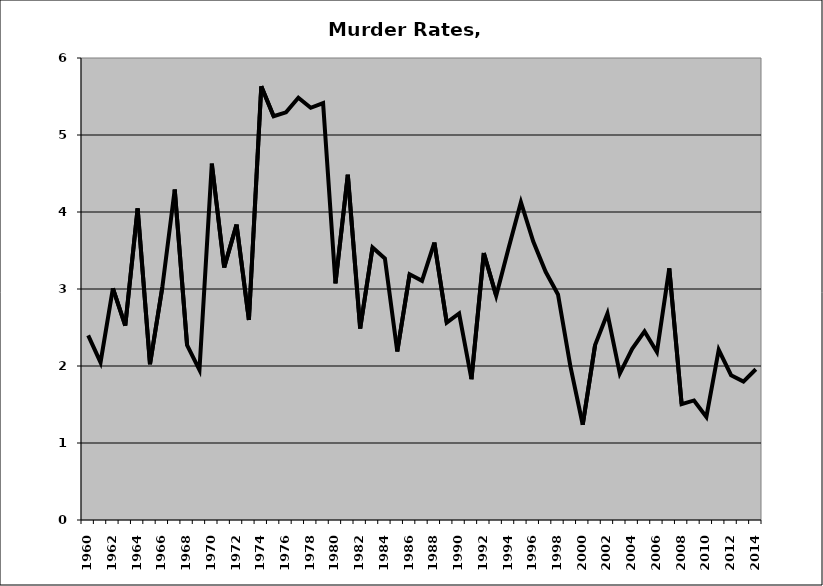
| Category | Murder |
|---|---|
| 1960.0 | 2.398 |
| 1961.0 | 2.047 |
| 1962.0 | 3.009 |
| 1963.0 | 2.525 |
| 1964.0 | 4.046 |
| 1965.0 | 2.023 |
| 1966.0 | 3.026 |
| 1967.0 | 4.292 |
| 1968.0 | 2.27 |
| 1969.0 | 1.95 |
| 1970.0 | 4.628 |
| 1971.0 | 3.279 |
| 1972.0 | 3.836 |
| 1973.0 | 2.597 |
| 1974.0 | 5.632 |
| 1975.0 | 5.244 |
| 1976.0 | 5.295 |
| 1977.0 | 5.484 |
| 1978.0 | 5.353 |
| 1979.0 | 5.414 |
| 1980.0 | 3.073 |
| 1981.0 | 4.484 |
| 1982.0 | 2.487 |
| 1983.0 | 3.539 |
| 1984.0 | 3.397 |
| 1985.0 | 2.189 |
| 1986.0 | 3.19 |
| 1987.0 | 3.106 |
| 1988.0 | 3.604 |
| 1989.0 | 2.564 |
| 1990.0 | 2.682 |
| 1991.0 | 1.829 |
| 1992.0 | 3.468 |
| 1993.0 | 2.912 |
| 1994.0 | 3.53 |
| 1995.0 | 4.127 |
| 1996.0 | 3.616 |
| 1997.0 | 3.223 |
| 1998.0 | 2.929 |
| 1999.0 | 1.997 |
| 2000.0 | 1.237 |
| 2001.0 | 2.272 |
| 2002.0 | 2.68 |
| 2003.0 | 1.902 |
| 2004.0 | 2.222 |
| 2005.0 | 2.449 |
| 2006.0 | 2.182 |
| 2007.0 | 3.268 |
| 2008.0 | 1.506 |
| 2009.0 | 1.553 |
| 2010.0 | 1.34 |
| 2011.0 | 2.21 |
| 2012.0 | 1.88 |
| 2013.0 | 1.798 |
| 2014.0 | 1.958 |